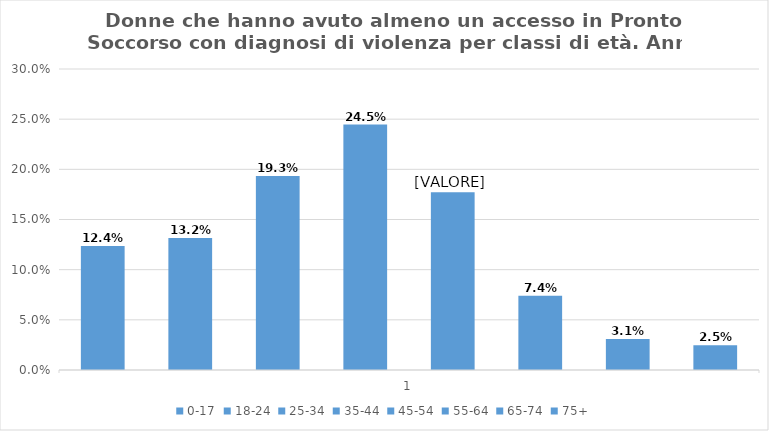
| Category | 0-17 | 18-24 | 25-34 | 35-44 | 45-54 | 55-64 | 65-74 | 75+ |
|---|---|---|---|---|---|---|---|---|
| 0 | 0.124 | 0.132 | 0.193 | 0.245 | 0.177 | 0.074 | 0.031 | 0.025 |